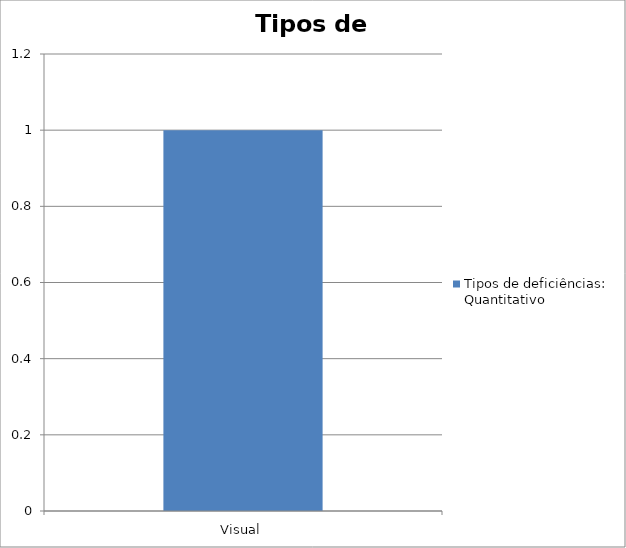
| Category | Tipos de deficiências: Quantitativo |
|---|---|
| Visual | 1 |